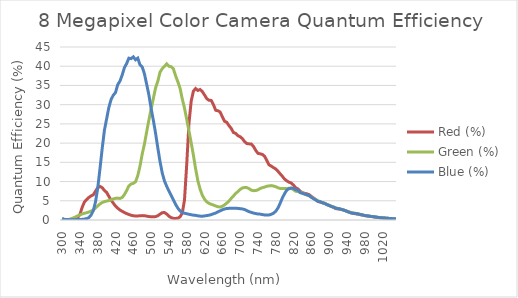
| Category | Red (%) | Green (%) | Blue (%) |
|---|---|---|---|
| 300.0 | 0.205 | 0.304 | 0.399 |
| 305.0 | 0.085 | 0.125 | 0.166 |
| 310.0 | 0.071 | 0.105 | 0.117 |
| 315.0 | 0.086 | 0.153 | 0.094 |
| 320.0 | 0.171 | 0.305 | 0.096 |
| 325.0 | 0.375 | 0.521 | 0.094 |
| 330.0 | 0.608 | 0.79 | 0.096 |
| 335.0 | 0.649 | 1.075 | 0.102 |
| 340.0 | 1.444 | 1.323 | 0.119 |
| 345.0 | 3.266 | 1.563 | 0.167 |
| 350.0 | 4.648 | 1.761 | 0.234 |
| 355.0 | 5.318 | 1.88 | 0.35 |
| 360.0 | 5.848 | 2.071 | 0.619 |
| 365.0 | 6.273 | 2.315 | 1.25 |
| 370.0 | 6.536 | 2.589 | 2.406 |
| 375.0 | 7.487 | 3.104 | 4.692 |
| 380.0 | 8.4 | 3.657 | 8.26 |
| 385.0 | 8.726 | 4.166 | 13.248 |
| 390.0 | 8.429 | 4.544 | 18.533 |
| 395.0 | 7.669 | 4.772 | 23.311 |
| 400.0 | 7.19 | 4.925 | 26.298 |
| 405.0 | 6.162 | 5.049 | 29.256 |
| 410.0 | 5.192 | 5.237 | 31.33 |
| 415.0 | 4.378 | 5.487 | 32.465 |
| 420.0 | 3.628 | 5.638 | 33.154 |
| 425.0 | 3.063 | 5.691 | 35.22 |
| 430.0 | 2.597 | 5.602 | 36.133 |
| 435.0 | 2.255 | 5.869 | 37.706 |
| 440.0 | 1.954 | 6.615 | 39.634 |
| 445.0 | 1.666 | 7.67 | 40.694 |
| 450.0 | 1.435 | 8.855 | 42.089 |
| 455.0 | 1.238 | 9.352 | 41.98 |
| 460.0 | 1.085 | 9.541 | 42.435 |
| 465.0 | 1.057 | 9.944 | 41.673 |
| 470.0 | 1.066 | 11.535 | 42.104 |
| 475.0 | 1.087 | 14.015 | 40.382 |
| 480.0 | 1.141 | 17.167 | 39.812 |
| 485.0 | 1.126 | 19.754 | 38.011 |
| 490.0 | 1.007 | 22.912 | 35.306 |
| 495.0 | 0.897 | 26.031 | 32.536 |
| 500.0 | 0.845 | 28.847 | 29.03 |
| 505.0 | 0.849 | 31.602 | 25.946 |
| 510.0 | 0.882 | 34.363 | 22.568 |
| 515.0 | 1.102 | 36.058 | 18.791 |
| 520.0 | 1.525 | 38.458 | 15.21 |
| 525.0 | 1.903 | 39.37 | 12.238 |
| 530.0 | 1.94 | 39.966 | 10.152 |
| 535.0 | 1.548 | 40.62 | 8.762 |
| 540.0 | 0.989 | 39.987 | 7.542 |
| 545.0 | 0.624 | 39.889 | 6.406 |
| 550.0 | 0.424 | 39.344 | 5.251 |
| 555.0 | 0.406 | 37.512 | 4.077 |
| 560.0 | 0.473 | 35.974 | 3.095 |
| 565.0 | 0.82 | 34.282 | 2.358 |
| 570.0 | 1.801 | 31.489 | 1.969 |
| 575.0 | 5.219 | 29.107 | 1.758 |
| 580.0 | 14.465 | 26.167 | 1.64 |
| 585.0 | 25.092 | 23.178 | 1.491 |
| 590.0 | 30.891 | 20.127 | 1.368 |
| 595.0 | 33.523 | 16.863 | 1.261 |
| 600.0 | 34.191 | 13.304 | 1.203 |
| 605.0 | 33.701 | 10.219 | 1.088 |
| 610.0 | 33.943 | 8.024 | 1.013 |
| 615.0 | 33.406 | 6.462 | 0.988 |
| 620.0 | 32.529 | 5.41 | 1.06 |
| 625.0 | 31.573 | 4.713 | 1.154 |
| 630.0 | 31.135 | 4.339 | 1.245 |
| 635.0 | 31.11 | 4.089 | 1.4 |
| 640.0 | 30.014 | 3.894 | 1.62 |
| 645.0 | 28.552 | 3.655 | 1.808 |
| 650.0 | 28.414 | 3.451 | 2.107 |
| 655.0 | 28.103 | 3.377 | 2.383 |
| 660.0 | 26.855 | 3.571 | 2.66 |
| 665.0 | 25.682 | 3.933 | 2.864 |
| 670.0 | 25.404 | 4.401 | 2.985 |
| 675.0 | 24.533 | 4.945 | 3.031 |
| 680.0 | 23.82 | 5.618 | 3.084 |
| 685.0 | 22.757 | 6.244 | 3.046 |
| 690.0 | 22.517 | 6.916 | 3.081 |
| 695.0 | 21.928 | 7.38 | 3.008 |
| 700.0 | 21.665 | 7.941 | 2.944 |
| 705.0 | 21.174 | 8.328 | 2.882 |
| 710.0 | 20.397 | 8.469 | 2.722 |
| 715.0 | 19.892 | 8.44 | 2.459 |
| 720.0 | 19.806 | 8.162 | 2.168 |
| 725.0 | 19.755 | 7.768 | 1.979 |
| 730.0 | 19.141 | 7.631 | 1.807 |
| 735.0 | 18.123 | 7.655 | 1.672 |
| 740.0 | 17.338 | 7.852 | 1.561 |
| 745.0 | 17.212 | 8.191 | 1.525 |
| 750.0 | 17.056 | 8.418 | 1.409 |
| 755.0 | 16.572 | 8.56 | 1.309 |
| 760.0 | 15.47 | 8.774 | 1.274 |
| 765.0 | 14.339 | 8.869 | 1.313 |
| 770.0 | 14.019 | 8.951 | 1.476 |
| 775.0 | 13.618 | 8.832 | 1.765 |
| 780.0 | 13.283 | 8.673 | 2.276 |
| 785.0 | 12.682 | 8.381 | 3.098 |
| 790.0 | 12.008 | 8.214 | 4.373 |
| 795.0 | 11.348 | 8.196 | 5.756 |
| 800.0 | 10.624 | 8.21 | 6.875 |
| 805.0 | 10.172 | 8.214 | 7.788 |
| 810.0 | 9.825 | 8.234 | 8.149 |
| 815.0 | 9.629 | 8.229 | 8.308 |
| 820.0 | 9.068 | 7.881 | 8.218 |
| 825.0 | 8.364 | 7.456 | 7.849 |
| 830.0 | 8.085 | 7.416 | 7.772 |
| 835.0 | 7.456 | 7.208 | 7.118 |
| 840.0 | 7.126 | 7.053 | 6.932 |
| 845.0 | 6.938 | 6.747 | 6.74 |
| 850.0 | 6.812 | 6.483 | 6.584 |
| 855.0 | 6.588 | 6.283 | 6.345 |
| 860.0 | 6.13 | 5.903 | 5.937 |
| 865.0 | 5.733 | 5.63 | 5.521 |
| 870.0 | 5.306 | 5.318 | 5.199 |
| 875.0 | 4.801 | 4.994 | 4.843 |
| 880.0 | 4.679 | 4.774 | 4.729 |
| 885.0 | 4.476 | 4.487 | 4.493 |
| 890.0 | 4.329 | 4.345 | 4.297 |
| 895.0 | 3.994 | 4.017 | 4.032 |
| 900.0 | 3.823 | 3.808 | 3.766 |
| 905.0 | 3.521 | 3.572 | 3.527 |
| 910.0 | 3.273 | 3.385 | 3.351 |
| 915.0 | 2.963 | 3.134 | 3.064 |
| 920.0 | 2.886 | 2.988 | 2.969 |
| 925.0 | 2.817 | 2.843 | 2.851 |
| 930.0 | 2.702 | 2.687 | 2.662 |
| 935.0 | 2.518 | 2.492 | 2.486 |
| 940.0 | 2.299 | 2.26 | 2.231 |
| 945.0 | 2.075 | 2.068 | 2.008 |
| 950.0 | 1.837 | 1.911 | 1.814 |
| 955.0 | 1.695 | 1.823 | 1.747 |
| 960.0 | 1.606 | 1.721 | 1.678 |
| 965.0 | 1.518 | 1.623 | 1.58 |
| 970.0 | 1.384 | 1.462 | 1.434 |
| 975.0 | 1.273 | 1.326 | 1.321 |
| 980.0 | 1.138 | 1.156 | 1.161 |
| 985.0 | 1.076 | 1.085 | 1.091 |
| 990.0 | 0.996 | 0.986 | 1.001 |
| 995.0 | 0.921 | 0.919 | 0.915 |
| 1000.0 | 0.834 | 0.838 | 0.848 |
| 1005.0 | 0.75 | 0.758 | 0.766 |
| 1010.0 | 0.666 | 0.677 | 0.68 |
| 1015.0 | 0.598 | 0.614 | 0.604 |
| 1020.0 | 0.549 | 0.572 | 0.552 |
| 1025.0 | 0.495 | 0.515 | 0.502 |
| 1030.0 | 0.454 | 0.466 | 0.455 |
| 1035.0 | 0.406 | 0.408 | 0.406 |
| 1040.0 | 0.368 | 0.363 | 0.362 |
| 1045.0 | 0.321 | 0.313 | 0.316 |
| 1050.0 | 0.276 | 0.267 | 0.27 |